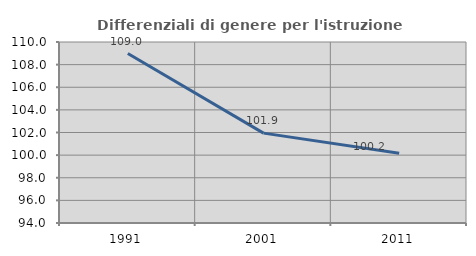
| Category | Differenziali di genere per l'istruzione superiore |
|---|---|
| 1991.0 | 108.983 |
| 2001.0 | 101.944 |
| 2011.0 | 100.174 |